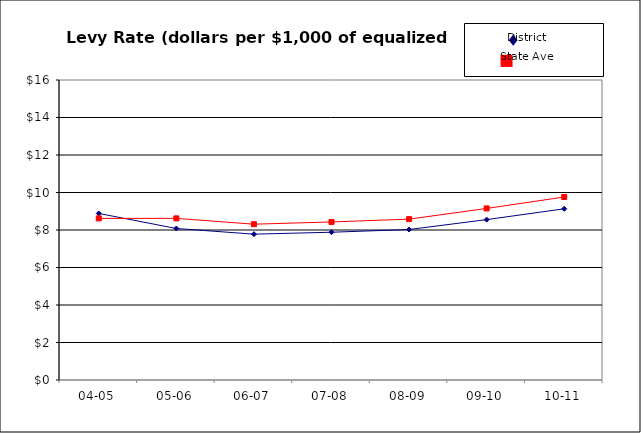
| Category | DISTRICT | STATEWIDE |
|---|---|---|
| 04-05 | 8.883 | 8.62 |
| 05-06 | 8.081 | 8.62 |
| 06-07 | 7.779 | 8.31 |
| 07-08 | 7.881 | 8.43 |
| 08-09 | 8.026 | 8.58 |
| 09-10 | 8.554 | 9.15 |
| 10-11 | 9.13 | 9.76 |